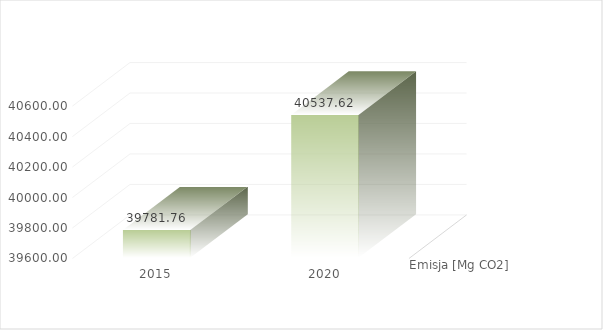
| Category | Emisja [Mg CO2] |
|---|---|
| 2015.0 | 39781.765 |
| 2020.0 | 40537.618 |